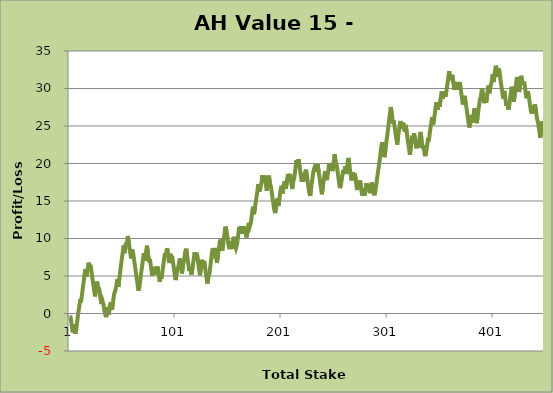
| Category | Series 0 |
|---|---|
| 0 | -0.5 |
| 1 | -0.5 |
| 2 | -1.5 |
| 3 | -2.5 |
| 4 | -1.45 |
| 5 | -2.45 |
| 6 | -2.45 |
| 7 | -1.29 |
| 8 | -0.16 |
| 9 | 0.75 |
| 10 | 1.71 |
| 11 | 1.71 |
| 12 | 2.79 |
| 13 | 3.9 |
| 14 | 5.01 |
| 15 | 5.92 |
| 16 | 4.92 |
| 17 | 5.9 |
| 18 | 6.78 |
| 19 | 6.28 |
| 20 | 6.28 |
| 21 | 5.28 |
| 22 | 4.28 |
| 23 | 3.28 |
| 24 | 2.28 |
| 25 | 3.25 |
| 26 | 4.26 |
| 27 | 3.26 |
| 28 | 3.26 |
| 29 | 2.26 |
| 30 | 1.26 |
| 31 | 1.72 |
| 32 | 1.22 |
| 33 | 0.22 |
| 34 | -0.28 |
| 35 | -0.28 |
| 36 | 0.84 |
| 37 | -0.16 |
| 38 | 1.04 |
| 39 | 1.49 |
| 40 | 0.49 |
| 41 | 1.49 |
| 42 | 2.56 |
| 43 | 2.99 |
| 44 | 3.555 |
| 45 | 4.545 |
| 46 | 3.545 |
| 47 | 4.655 |
| 48 | 5.815 |
| 49 | 6.975 |
| 50 | 7.955 |
| 51 | 9.055 |
| 52 | 8.055 |
| 53 | 9.205 |
| 54 | 9.205 |
| 55 | 10.345 |
| 56 | 9.345 |
| 57 | 8.345 |
| 58 | 7.345 |
| 59 | 8.545 |
| 60 | 8.045 |
| 61 | 7.045 |
| 62 | 6.045 |
| 63 | 5.045 |
| 64 | 4.045 |
| 65 | 3.045 |
| 66 | 3.615 |
| 67 | 4.815 |
| 68 | 5.885 |
| 69 | 6.895 |
| 70 | 8.025 |
| 71 | 7.025 |
| 72 | 8.035 |
| 73 | 9.045 |
| 74 | 8.045 |
| 75 | 7.045 |
| 76 | 7.045 |
| 77 | 6.045 |
| 78 | 5.045 |
| 79 | 6.175 |
| 80 | 5.175 |
| 81 | 6.225 |
| 82 | 5.225 |
| 83 | 6.255 |
| 84 | 5.255 |
| 85 | 4.255 |
| 86 | 4.865 |
| 87 | 4.865 |
| 88 | 5.965 |
| 89 | 7.035 |
| 90 | 8.035 |
| 91 | 7.535 |
| 92 | 8.725 |
| 93 | 7.725 |
| 94 | 6.725 |
| 95 | 7.955 |
| 96 | 7.455 |
| 97 | 7.455 |
| 98 | 6.455 |
| 99 | 5.455 |
| 100 | 4.455 |
| 101 | 5.415 |
| 102 | 5.875 |
| 103 | 6.445 |
| 104 | 7.335 |
| 105 | 6.335 |
| 106 | 5.335 |
| 107 | 6.485 |
| 108 | 7.025 |
| 109 | 8.115 |
| 110 | 8.65 |
| 111 | 7.65 |
| 112 | 6.65 |
| 113 | 5.65 |
| 114 | 6.155 |
| 115 | 5.155 |
| 116 | 6.125 |
| 117 | 7.115 |
| 118 | 8.155 |
| 119 | 7.155 |
| 120 | 8.095 |
| 121 | 7.095 |
| 122 | 6.095 |
| 123 | 5.095 |
| 124 | 6.135 |
| 125 | 7.165 |
| 126 | 6.165 |
| 127 | 7.005 |
| 128 | 6.005 |
| 129 | 5.005 |
| 130 | 4.005 |
| 131 | 4.905 |
| 132 | 5.365 |
| 133 | 6.535 |
| 134 | 7.725 |
| 135 | 8.685 |
| 136 | 8.185 |
| 137 | 8.74 |
| 138 | 7.74 |
| 139 | 6.74 |
| 140 | 7.8 |
| 141 | 8.75 |
| 142 | 9.86 |
| 143 | 9.36 |
| 144 | 8.36 |
| 145 | 9.36 |
| 146 | 10.46 |
| 147 | 11.58 |
| 148 | 11.08 |
| 149 | 10.08 |
| 150 | 9.08 |
| 151 | 8.58 |
| 152 | 9.61 |
| 153 | 8.61 |
| 154 | 9.66 |
| 155 | 10.23 |
| 156 | 9.23 |
| 157 | 8.73 |
| 158 | 9.255 |
| 159 | 10.325 |
| 160 | 11.555 |
| 161 | 11.055 |
| 162 | 11.64 |
| 163 | 10.64 |
| 164 | 11.62 |
| 165 | 10.62 |
| 166 | 11.15 |
| 167 | 10.15 |
| 168 | 11.12 |
| 169 | 12.1 |
| 170 | 11.6 |
| 171 | 12.09 |
| 172 | 13.18 |
| 173 | 14.24 |
| 174 | 13.24 |
| 175 | 14.25 |
| 176 | 15.18 |
| 177 | 16.11 |
| 178 | 17.25 |
| 179 | 16.25 |
| 180 | 16.78 |
| 181 | 17.365 |
| 182 | 18.435 |
| 183 | 17.435 |
| 184 | 18.375 |
| 185 | 17.375 |
| 186 | 16.375 |
| 187 | 17.535 |
| 188 | 18.385 |
| 189 | 17.385 |
| 190 | 16.885 |
| 191 | 15.885 |
| 192 | 14.885 |
| 193 | 13.885 |
| 194 | 13.385 |
| 195 | 14.415 |
| 196 | 15.335 |
| 197 | 14.335 |
| 198 | 15.365 |
| 199 | 16.455 |
| 200 | 17.015 |
| 201 | 16.015 |
| 202 | 17.165 |
| 203 | 17.615 |
| 204 | 16.615 |
| 205 | 17.685 |
| 206 | 18.615 |
| 207 | 17.615 |
| 208 | 18.605 |
| 209 | 17.605 |
| 210 | 16.605 |
| 211 | 17.595 |
| 212 | 18.075 |
| 213 | 19.245 |
| 214 | 20.435 |
| 215 | 19.435 |
| 216 | 20.575 |
| 217 | 19.575 |
| 218 | 18.575 |
| 219 | 17.575 |
| 220 | 18.635 |
| 221 | 17.635 |
| 222 | 18.715 |
| 223 | 19.175 |
| 224 | 18.175 |
| 225 | 17.175 |
| 226 | 16.175 |
| 227 | 15.675 |
| 228 | 16.985 |
| 229 | 17.885 |
| 230 | 18.955 |
| 231 | 19.41 |
| 232 | 19.865 |
| 233 | 18.865 |
| 234 | 19.895 |
| 235 | 18.895 |
| 236 | 17.895 |
| 237 | 16.895 |
| 238 | 15.895 |
| 239 | 17.065 |
| 240 | 18.065 |
| 241 | 18.995 |
| 242 | 17.995 |
| 243 | 17.995 |
| 244 | 19.025 |
| 245 | 20.065 |
| 246 | 19.065 |
| 247 | 19.995 |
| 248 | 18.995 |
| 249 | 19.995 |
| 250 | 21.225 |
| 251 | 20.225 |
| 252 | 19.725 |
| 253 | 18.725 |
| 254 | 17.725 |
| 255 | 16.725 |
| 256 | 17.205 |
| 257 | 18.095 |
| 258 | 19.125 |
| 259 | 18.625 |
| 260 | 19.595 |
| 261 | 18.595 |
| 262 | 19.735 |
| 263 | 20.745 |
| 264 | 19.745 |
| 265 | 18.745 |
| 266 | 17.745 |
| 267 | 18.805 |
| 268 | 17.805 |
| 269 | 18.705 |
| 270 | 17.705 |
| 271 | 16.705 |
| 272 | 16.705 |
| 273 | 17.24 |
| 274 | 17.73 |
| 275 | 16.73 |
| 276 | 15.73 |
| 277 | 16.71 |
| 278 | 15.71 |
| 279 | 16.305 |
| 280 | 17.385 |
| 281 | 16.385 |
| 282 | 17.265 |
| 283 | 16.265 |
| 284 | 16.265 |
| 285 | 17.465 |
| 286 | 16.965 |
| 287 | 15.965 |
| 288 | 15.965 |
| 289 | 16.905 |
| 290 | 17.915 |
| 291 | 18.995 |
| 292 | 19.885 |
| 293 | 20.965 |
| 294 | 22.245 |
| 295 | 22.84 |
| 296 | 21.84 |
| 297 | 20.84 |
| 298 | 21.89 |
| 299 | 23.09 |
| 300 | 24.08 |
| 301 | 25.3 |
| 302 | 26.45 |
| 303 | 27.53 |
| 304 | 26.53 |
| 305 | 25.53 |
| 306 | 25.53 |
| 307 | 24.53 |
| 308 | 23.53 |
| 309 | 22.53 |
| 310 | 23.66 |
| 311 | 24.68 |
| 312 | 25.67 |
| 313 | 24.67 |
| 314 | 25.25 |
| 315 | 25.25 |
| 316 | 24.25 |
| 317 | 25.15 |
| 318 | 24.15 |
| 319 | 23.15 |
| 320 | 22.15 |
| 321 | 21.15 |
| 322 | 22.34 |
| 323 | 23.7 |
| 324 | 22.7 |
| 325 | 24.02 |
| 326 | 23.02 |
| 327 | 22.02 |
| 328 | 23.09 |
| 329 | 22.09 |
| 330 | 23.22 |
| 331 | 24.21 |
| 332 | 23.21 |
| 333 | 22.21 |
| 334 | 22.21 |
| 335 | 21.21 |
| 336 | 21.21 |
| 337 | 22.11 |
| 338 | 23.16 |
| 339 | 23.16 |
| 340 | 24.33 |
| 341 | 25.26 |
| 342 | 26.19 |
| 343 | 25.19 |
| 344 | 26.09 |
| 345 | 27.16 |
| 346 | 28.16 |
| 347 | 27.16 |
| 348 | 28.06 |
| 349 | 27.56 |
| 350 | 28.57 |
| 351 | 29.61 |
| 352 | 28.61 |
| 353 | 29.64 |
| 354 | 29.14 |
| 355 | 29.14 |
| 356 | 30.2 |
| 357 | 31.21 |
| 358 | 32.31 |
| 359 | 31.31 |
| 360 | 31.31 |
| 361 | 31.82 |
| 362 | 30.82 |
| 363 | 29.82 |
| 364 | 30.82 |
| 365 | 29.82 |
| 366 | 30.87 |
| 367 | 29.87 |
| 368 | 30.85 |
| 369 | 29.85 |
| 370 | 28.85 |
| 371 | 27.85 |
| 372 | 28.79 |
| 373 | 28.79 |
| 374 | 27.79 |
| 375 | 26.79 |
| 376 | 25.79 |
| 377 | 24.79 |
| 378 | 25.28 |
| 379 | 26.48 |
| 380 | 25.48 |
| 381 | 26.4 |
| 382 | 27.37 |
| 383 | 26.37 |
| 384 | 25.37 |
| 385 | 26.41 |
| 386 | 27.46 |
| 387 | 28.45 |
| 388 | 28.975 |
| 389 | 30.045 |
| 390 | 29.045 |
| 391 | 28.045 |
| 392 | 29.115 |
| 393 | 28.115 |
| 394 | 29.305 |
| 395 | 30.375 |
| 396 | 29.375 |
| 397 | 30.325 |
| 398 | 30.79 |
| 399 | 31.87 |
| 400 | 30.87 |
| 401 | 32.05 |
| 402 | 33.03 |
| 403 | 32.53 |
| 404 | 31.53 |
| 405 | 32.66 |
| 406 | 31.66 |
| 407 | 30.66 |
| 408 | 29.66 |
| 409 | 28.66 |
| 410 | 29.69 |
| 411 | 28.69 |
| 412 | 27.69 |
| 413 | 28.2 |
| 414 | 27.2 |
| 415 | 28.15 |
| 416 | 29.17 |
| 417 | 30.24 |
| 418 | 29.24 |
| 419 | 28.24 |
| 420 | 29.34 |
| 421 | 30.49 |
| 422 | 31.53 |
| 423 | 30.53 |
| 424 | 29.53 |
| 425 | 30.65 |
| 426 | 31.7 |
| 427 | 30.7 |
| 428 | 30.7 |
| 429 | 30.7 |
| 430 | 29.7 |
| 431 | 28.7 |
| 432 | 29.63 |
| 433 | 29.13 |
| 434 | 28.13 |
| 435 | 27.13 |
| 436 | 26.63 |
| 437 | 27.75 |
| 438 | 26.75 |
| 439 | 27.92 |
| 440 | 26.92 |
| 441 | 25.92 |
| 442 | 25.42 |
| 443 | 24.42 |
| 444 | 23.42 |
| 445 | 24.52 |
| 446 | 25.66 |
| 447 | 25.16 |